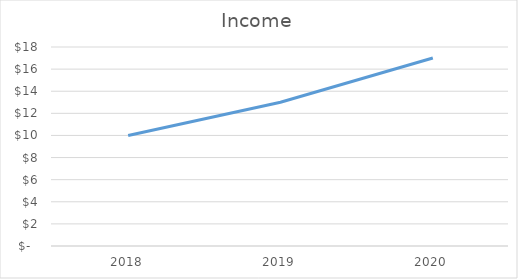
| Category | Income |
|---|---|
| 2018.0 | 10 |
| 2019.0 | 13 |
| 2020.0 | 17 |